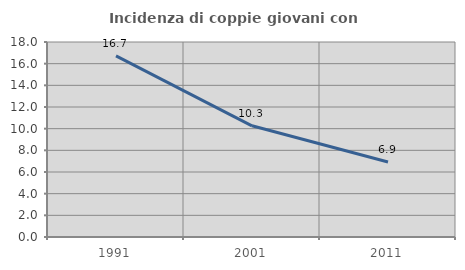
| Category | Incidenza di coppie giovani con figli |
|---|---|
| 1991.0 | 16.725 |
| 2001.0 | 10.263 |
| 2011.0 | 6.921 |